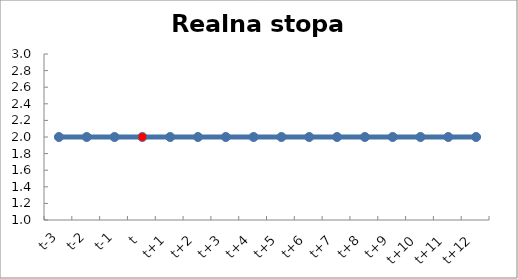
| Category | Series 1 | Realna stopa procentowa r |
|---|---|---|
| t-3 | 2 | 2 |
| t-2 | 2 | 2 |
| t-1 | 2 | 2 |
| t | 2 | 2 |
| t+1 | 2 | 2 |
| t+2 | 2 | 2 |
| t+3 | 2 | 2 |
| t+4 | 2 | 2 |
| t+5 | 2 | 2 |
| t+6 | 2 | 2 |
| t+7 | 2 | 2 |
| t+8 | 2 | 2 |
| t+9 | 2 | 2 |
| t+10 | 2 | 2 |
| t+11 | 2 | 2 |
| t+12 | 2 | 2 |